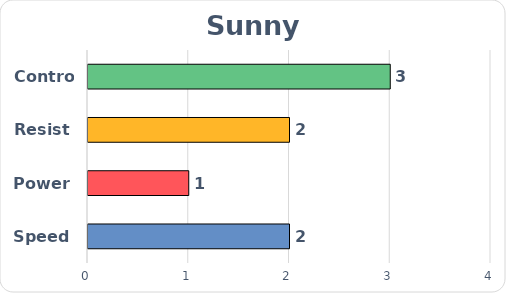
| Category | Series 0 |
|---|---|
| Speed | 2 |
| Power | 1 |
| Resist | 2 |
| Control | 3 |